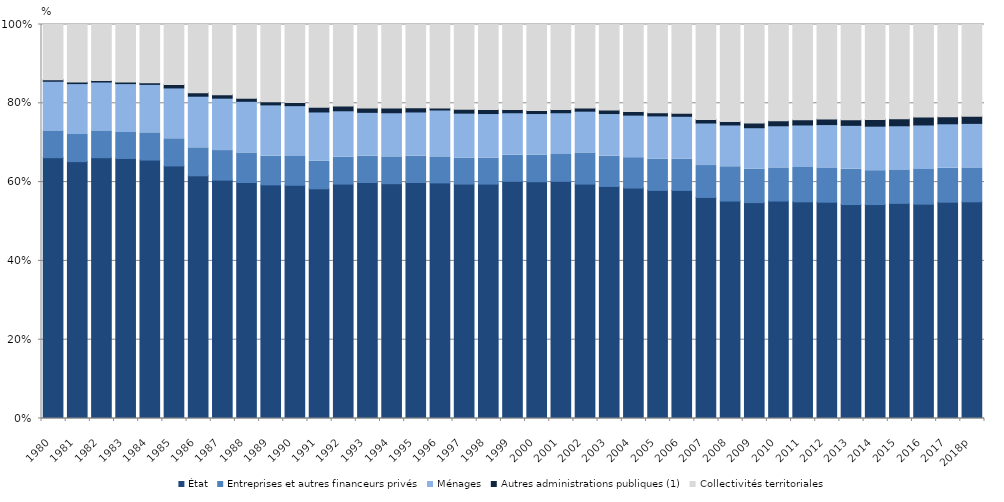
| Category | État | Entreprises et autres financeurs privés | Ménages | Autres administrations publiques (1) | Collectivités territoriales |
|---|---|---|---|---|---|
| 1980 | 66.2 | 6.8 | 12.6 | 0.4 | 14 |
| 1981 | 65.2 | 6.9 | 12.9 | 0.4 | 14.6 |
| 1982 | 66.2 | 6.8 | 12.4 | 0.4 | 14.2 |
| 1983 | 66 | 6.6 | 12.4 | 0.4 | 14.6 |
| 1984 | 65.6 | 6.9 | 12.3 | 0.4 | 14.8 |
| 1985 | 64.1 | 6.9 | 12.9 | 0.9 | 15.2 |
| 1986 | 61.6 | 7.1 | 13.1 | 0.9 | 17.3 |
| 1987 | 60.5 | 7.5 | 13.3 | 0.9 | 17.8 |
| 1988 | 59.9 | 7.5 | 13.1 | 0.8 | 18.7 |
| 1989 | 59.3 | 7.3 | 13 | 0.8 | 19.6 |
| 1990 | 59.2 | 7.3 | 12.9 | 0.8 | 19.8 |
| 1991 | 58.3 | 7 | 12.5 | 1.2 | 21 |
| 1992 | 59.5 | 6.8 | 11.8 | 1.2 | 20.7 |
| 1993 | 59.9 | 6.7 | 11.1 | 1.1 | 21.2 |
| 1994 | 59.6 | 6.8 | 11.2 | 1.2 | 21.2 |
| 1995 | 59.9 | 6.7 | 11.2 | 1.1 | 21.1 |
| 1996 | 59.8 | 6.6 | 11.9 | 0.5 | 21.2 |
| 1997 | 59.5 | 6.6 | 11.4 | 1 | 21.5 |
| 1998 | 59.5 | 6.6 | 11.3 | 1 | 21.6 |
| 1999 | 60.2 | 6.6 | 10.8 | 0.8 | 21.6 |
| 2000 | 60.1 | 6.7 | 10.6 | 0.8 | 21.8 |
| 2001 | 60.2 | 6.8 | 10.6 | 0.8 | 21.6 |
| 2002 | 59.5 | 7.9 | 10.6 | 0.8 | 21.2 |
| 2003 | 58.9 | 7.7 | 10.8 | 0.9 | 21.7 |
| 2004 | 58.5 | 7.7 | 10.8 | 0.9 | 22.1 |
| 2005 | 57.9 | 7.9 | 11 | 0.8 | 22.4 |
| 2006 | 57.9 | 7.9 | 10.9 | 0.8 | 22.5 |
| 2007 | 56.1 | 8.1 | 10.8 | 0.9 | 24.1 |
| 2008 | 55.2 | 8.7 | 10.6 | 0.9 | 24.6 |
| 2009 | 54.8 | 8.5 | 10.5 | 1.2 | 25 |
| 2010 | 55.2 | 8.4 | 10.7 | 1.3 | 24.4 |
| 2011 | 55 | 8.7 | 10.8 | 1.3 | 24.2 |
| 2012 | 54.9 | 8.7 | 11 | 1.4 | 24 |
| 2013 | 54.3 | 9 | 11.1 | 1.4 | 24.2 |
| 2014 | 54.3 | 8.6 | 11.3 | 1.7 | 24.1 |
| 2015 | 54.6 | 8.5 | 11.2 | 1.8 | 23.9 |
| 2016 | 54.4 | 8.8 | 11.3 | 2 | 23.5 |
| 2017 | 54.9 | 8.6 | 11.3 | 1.8 | 23.4 |
| 2018p | 55 | 8.6 | 11.3 | 1.8 | 23.3 |